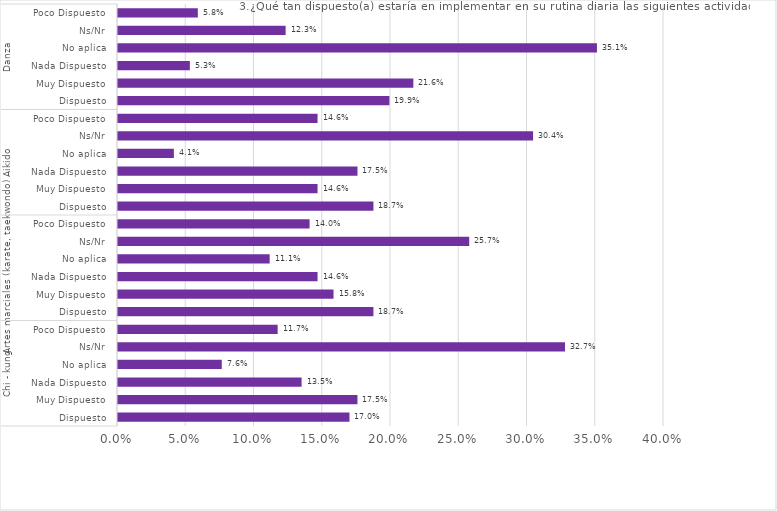
| Category | Series 0 |
|---|---|
| 0 | 0.17 |
| 1 | 0.175 |
| 2 | 0.135 |
| 3 | 0.076 |
| 4 | 0.327 |
| 5 | 0.117 |
| 6 | 0.187 |
| 7 | 0.158 |
| 8 | 0.146 |
| 9 | 0.111 |
| 10 | 0.257 |
| 11 | 0.14 |
| 12 | 0.187 |
| 13 | 0.146 |
| 14 | 0.175 |
| 15 | 0.041 |
| 16 | 0.304 |
| 17 | 0.146 |
| 18 | 0.199 |
| 19 | 0.216 |
| 20 | 0.053 |
| 21 | 0.351 |
| 22 | 0.123 |
| 23 | 0.058 |